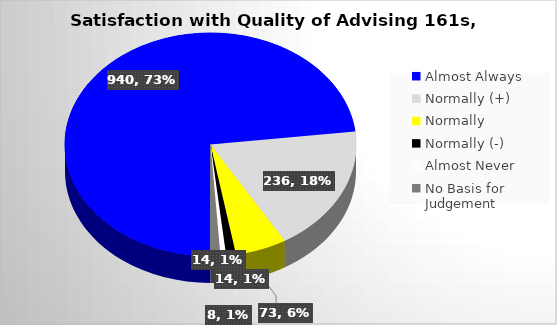
| Category | Series 0 |
|---|---|
| Almost Always | 940 |
| Normally (+) | 236 |
| Normally  | 73 |
| Normally (-) | 14 |
| Almost Never | 8 |
| No Basis for Judgement | 14 |